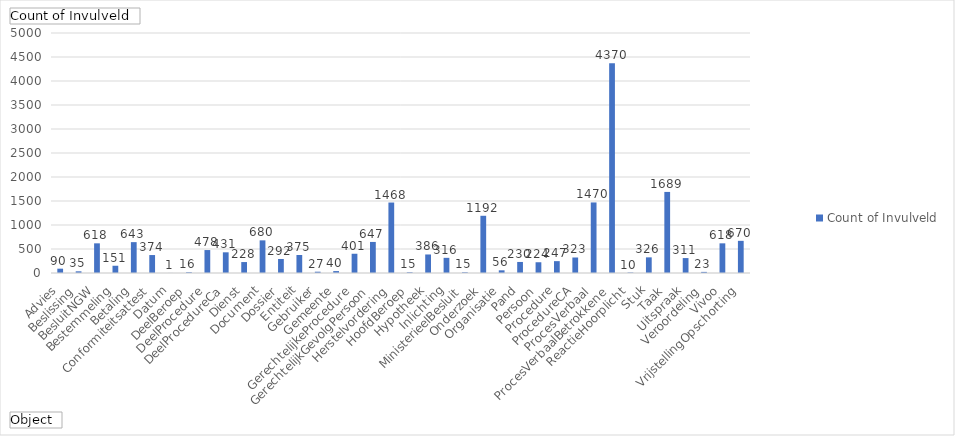
| Category | Totaal |
|---|---|
| Advies | 90 |
| Beslissing | 35 |
| BesluitNGW | 618 |
| Bestemmeling | 151 |
| Betaling | 643 |
| Conformiteitsattest | 374 |
| Datum | 1 |
| DeelBeroep | 16 |
| DeelProcedure | 478 |
| DeelProcedureCa | 431 |
| Dienst | 228 |
| Document | 680 |
| Dossier | 292 |
| Entiteit | 375 |
| Gebruiker | 27 |
| Gemeente | 40 |
| GerechtelijkeProcedure | 401 |
| GerechtelijkGevolgPersoon | 647 |
| Herstelvordering | 1468 |
| HoofdBeroep | 15 |
| Hypotheek | 386 |
| Inlichting | 316 |
| MinisterieelBesluit | 15 |
| Onderzoek | 1192 |
| Organisatie | 56 |
| Pand | 230 |
| Persoon | 224 |
| Procedure | 247 |
| ProcedureCA | 323 |
| ProcesVerbaal | 1470 |
| ProcesVerbaalBetrokkene | 4370 |
| ReactieHoorplicht | 10 |
| Stuk | 326 |
| Taak | 1689 |
| Uitspraak | 311 |
| Veroordeling | 23 |
| Vivoo | 618 |
| VrijstellingOpschorting | 670 |